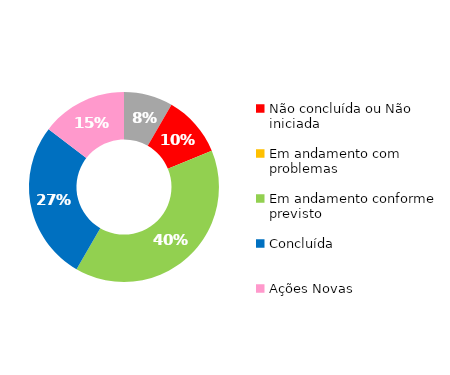
| Category | Series 0 |
|---|---|
| Início planejado posterior | 4 |
| Não concluída ou Não iniciada | 5 |
| Em andamento com problemas | 0 |
| Em andamento conforme previsto | 19 |
| Concluída | 13 |
| Ações Novas | 7 |